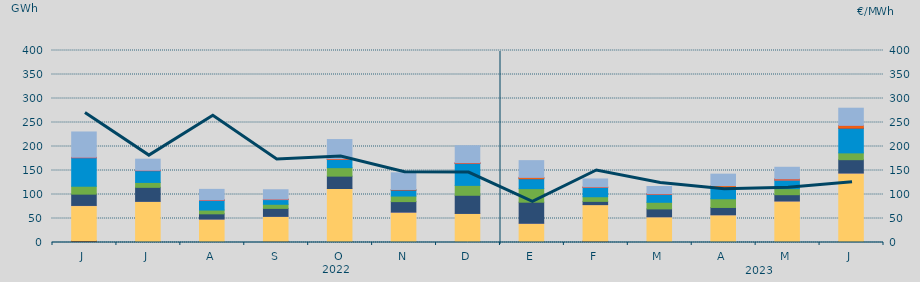
| Category | Carbón | Ciclo Combinado | Cogeneración | Consumo Bombeo | Eólica | Hidráulica | Nuclear | Otras Renovables | Solar fotovoltaica | Solar térmica | Turbinación bombeo |
|---|---|---|---|---|---|---|---|---|---|---|---|
| J | 3803.776 | 72994.164 | 408.816 | 23523.459 | 16484.811 | 59296.475 | 327.825 | 3.325 | 281.65 | 342.175 | 52808.788 |
| J | 2026.357 | 83630.229 | 62.5 | 29193.443 | 10247.658 | 24517.982 | 107.35 | 0 | 186.925 | 340.15 | 23284.195 |
| A | 608.425 | 48201.184 | 25.75 | 10881.743 | 7912.923 | 20661.25 | 49.5 | 8.225 | 251.425 | 88.725 | 21982.08 |
| S | 2432.475 | 52018.85 | 0.5 | 16627 | 8549.825 | 9810.3 | 0 | 23 | 777.175 | 6.75 | 19642.325 |
| O | 1876.1 | 110603.205 | 45 | 25745.4 | 17659.375 | 17006.05 | 12.825 | 16.6 | 1409.775 | 15.5 | 40055.836 |
| N | 1396.025 | 61724.955 | 198.008 | 21869.975 | 11579.495 | 12449.175 | 266.725 | 0 | 996.225 | 0 | 34713.224 |
| D | 1126.208 | 59335.684 | 104.85 | 37837.8 | 20596.98 | 45465.168 | 544.3 | 0 | 1011.875 | 1.5 | 35471.986 |
| E | 478.95 | 39560.875 | 26.867 | 43909.242 | 28275.092 | 20601.292 | 143.6 | 0 | 2603.242 | 1.5 | 34937.333 |
| F | 2850.925 | 76083.275 | 1.55 | 6739.65 | 9661.175 | 19240.1 | 0 | 0 | 962.675 | 47.25 | 16781.025 |
| M | 1195.025 | 52392.533 | 3.3 | 16393.158 | 13789.6 | 16980.517 | 40.625 | 4.5 | 911.6 | 43.15 | 14940.475 |
| A | 218.875 | 57485.65 | 46.225 | 15258.175 | 18096.25 | 24086.65 | 63.45 | 0 | 3316.075 | 0 | 23819.559 |
| M | 150.482 | 86315.465 | 30 | 13099.874 | 12607.441 | 17784.926 | 256.325 | 2 | 2256.963 | 1.5 | 24199.004 |
| J | 1968.975 | 142738.351 | 35.225 | 27797.375 | 14167.175 | 51399.925 | 228.125 | 0 | 5290.65 | 319.5 | 35835.25 |